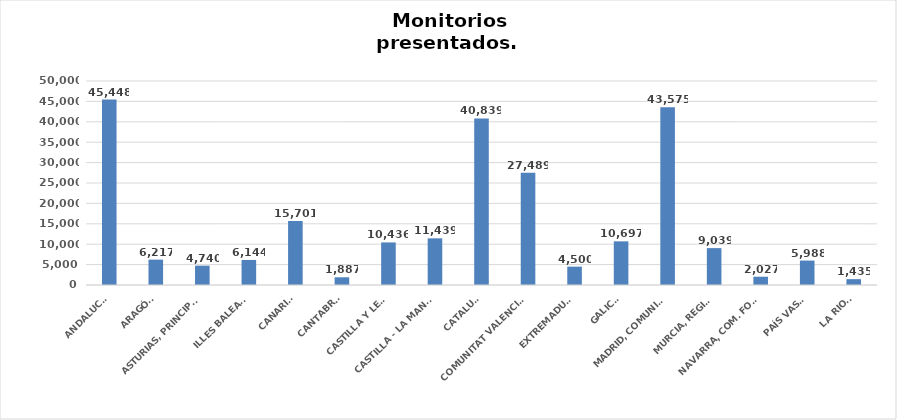
| Category | Series 0 |
|---|---|
| ANDALUCÍA | 45448 |
| ARAGÓN | 6217 |
| ASTURIAS, PRINCIPADO | 4740 |
| ILLES BALEARS | 6144 |
| CANARIAS | 15701 |
| CANTABRIA | 1887 |
| CASTILLA Y LEÓN | 10436 |
| CASTILLA - LA MANCHA | 11439 |
| CATALUÑA | 40839 |
| COMUNITAT VALENCIANA | 27489 |
| EXTREMADURA | 4500 |
| GALICIA | 10697 |
| MADRID, COMUNIDAD | 43575 |
| MURCIA, REGIÓN | 9039 |
| NAVARRA, COM. FORAL | 2027 |
| PAÍS VASCO | 5988 |
| LA RIOJA | 1435 |